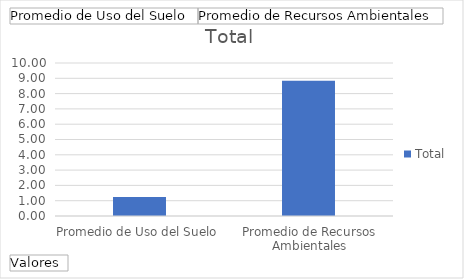
| Category | Total |
|---|---|
| Promedio de Uso del Suelo | 1.239 |
| Promedio de Recursos Ambientales | 8.84 |